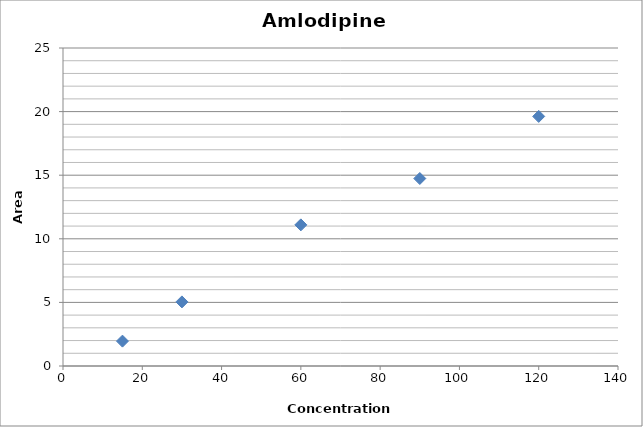
| Category | Series 0 |
|---|---|
| 15.0 | 1.955 |
| 30.0 | 5.04 |
| 60.0 | 11.096 |
| 90.0 | 14.74 |
| 120.0 | 19.621 |